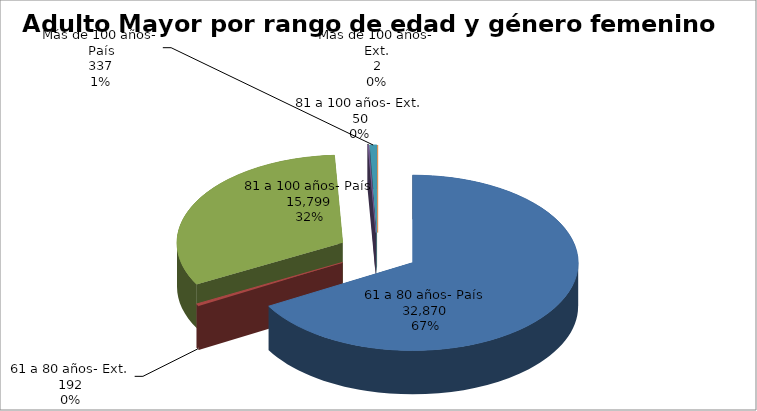
| Category | Series 0 |
|---|---|
| 61 a 80 años- País | 32870 |
| 61 a 80 años- Ext. | 192 |
| 81 a 100 años- País | 15799 |
| 81 a 100 años- Ext. | 50 |
| Más de 100 años- País | 337 |
| Más de 100 años- Ext. | 2 |